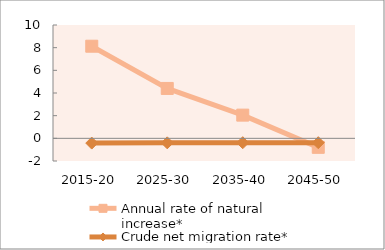
| Category | Annual rate of natural increase* | Crude net migration rate* |
|---|---|---|
| 2015-20 | 8.129 | -0.42 |
| 2025-30 | 4.402 | -0.397 |
| 2035-40 | 2.047 | -0.386 |
| 2045-50 | -0.794 | -0.385 |